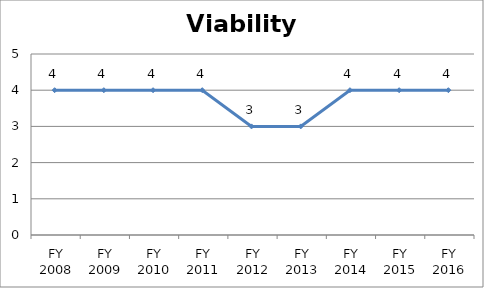
| Category | Viability score |
|---|---|
| FY 2016 | 4 |
| FY 2015 | 4 |
| FY 2014 | 4 |
| FY 2013 | 3 |
| FY 2012 | 3 |
| FY 2011 | 4 |
| FY 2010 | 4 |
| FY 2009 | 4 |
| FY 2008 | 4 |